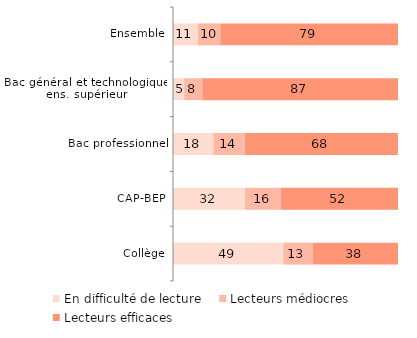
| Category | En difficulté de lecture | Lecteurs médiocres | Lecteurs efficaces |
|---|---|---|---|
| Collège | 49 | 13 | 38 |
| CAP-BEP | 32 | 16 | 52 |
| Bac professionnel | 18 | 14 | 68.126 |
| Bac général et technologique, ens. supérieur | 5 | 8 | 87.022 |
| Ensemble | 11 | 10 | 79 |